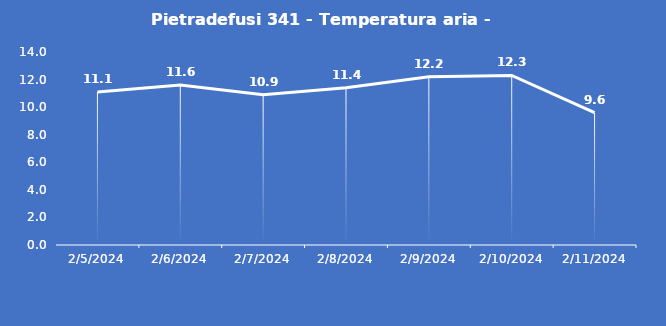
| Category | Pietradefusi 341 - Temperatura aria - Grezzo (°C) |
|---|---|
| 2/5/24 | 11.1 |
| 2/6/24 | 11.6 |
| 2/7/24 | 10.9 |
| 2/8/24 | 11.4 |
| 2/9/24 | 12.2 |
| 2/10/24 | 12.3 |
| 2/11/24 | 9.6 |